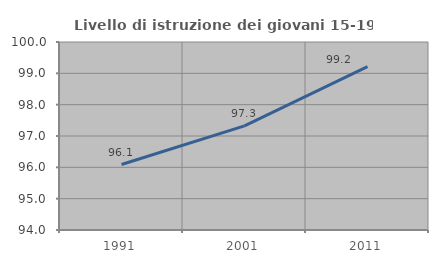
| Category | Livello di istruzione dei giovani 15-19 anni |
|---|---|
| 1991.0 | 96.089 |
| 2001.0 | 97.321 |
| 2011.0 | 99.213 |